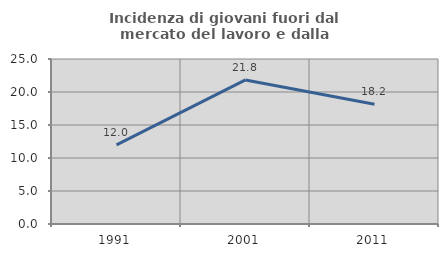
| Category | Incidenza di giovani fuori dal mercato del lavoro e dalla formazione  |
|---|---|
| 1991.0 | 11.982 |
| 2001.0 | 21.832 |
| 2011.0 | 18.158 |